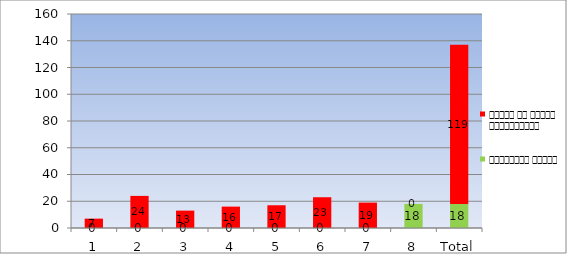
| Category | गृहकार्य वितरण | वितरण से वंचित विद्यार्थी |
|---|---|---|
| 1 | 0 | 7 |
| 2 | 0 | 24 |
| 3 | 0 | 13 |
| 4 | 0 | 16 |
| 5 | 0 | 17 |
| 6 | 0 | 23 |
| 7 | 0 | 19 |
| 8 | 18 | 0 |
| Total | 18 | 119 |